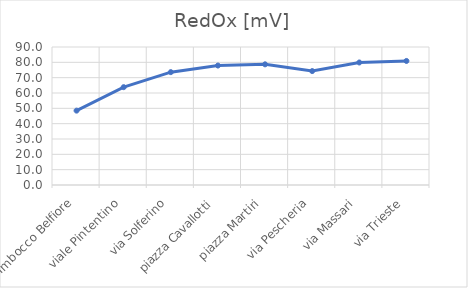
| Category | RedOx [mV] |
|---|---|
| Imbocco Belfiore | 48.5 |
| viale Pintentino | 63.8 |
| via Solferino | 73.6 |
| piazza Cavallotti | 77.9 |
| piazza Martiri | 78.7 |
| via Pescheria | 74.3 |
| via Massari | 79.9 |
| via Trieste | 80.9 |